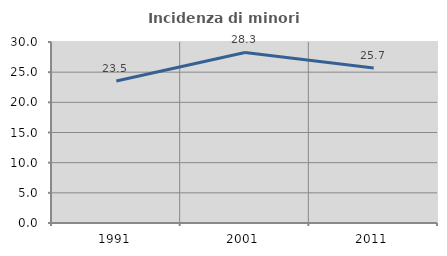
| Category | Incidenza di minori stranieri |
|---|---|
| 1991.0 | 23.529 |
| 2001.0 | 28.261 |
| 2011.0 | 25.694 |